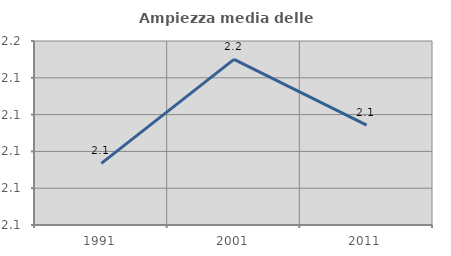
| Category | Ampiezza media delle famiglie |
|---|---|
| 1991.0 | 2.093 |
| 2001.0 | 2.15 |
| 2011.0 | 2.114 |